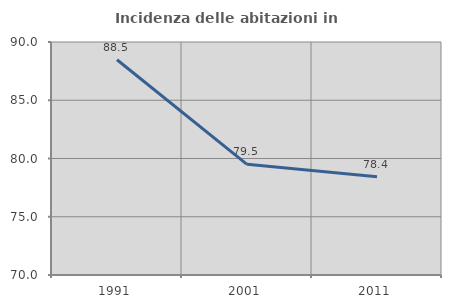
| Category | Incidenza delle abitazioni in proprietà  |
|---|---|
| 1991.0 | 88.475 |
| 2001.0 | 79.502 |
| 2011.0 | 78.443 |